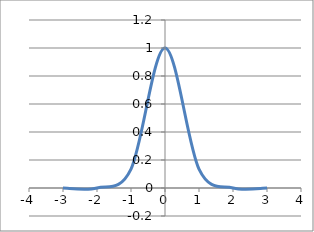
| Category | Series 0 |
|---|---|
| -3.0 | 0 |
| -2.0 | 0 |
| -1.0 | 0.135 |
| 0.0 | 1 |
| 1.0 | 0.135 |
| 2.0 | 0 |
| 3.0 | 0 |